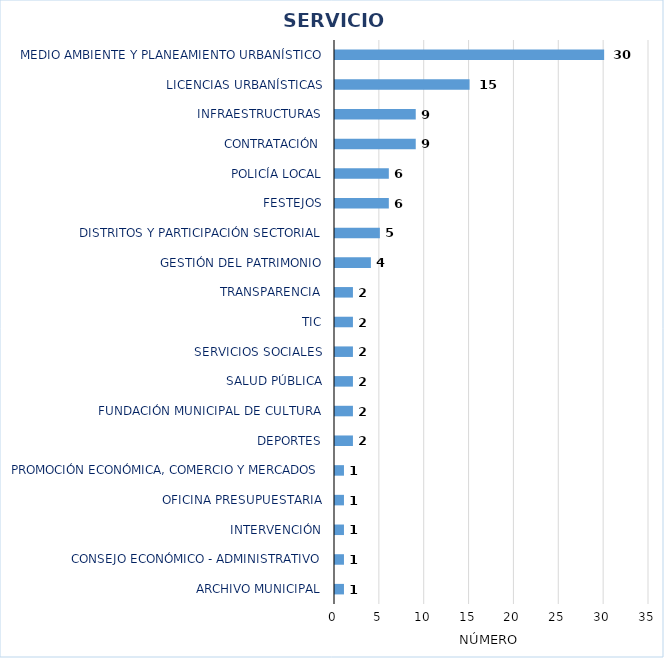
| Category | NÚMERO |
|---|---|
| Archivo Municipal | 1 |
| Consejo Económico - Administrativo | 1 |
| Intervención | 1 |
| Oficina Presupuestaria | 1 |
| Promoción Económica, Comercio y Mercados | 1 |
| Deportes | 2 |
| Fundación Municipal de Cultura | 2 |
| Salud Pública | 2 |
| Servicios Sociales | 2 |
| TIC | 2 |
| Transparencia | 2 |
| Gestión del Patrimonio | 4 |
| Distritos y Participación Sectorial | 5 |
| Festejos | 6 |
| Policía Local | 6 |
| Contratación | 9 |
| Infraestructuras | 9 |
| Licencias Urbanísticas | 15 |
| Medio Ambiente y Planeamiento Urbanístico | 30 |